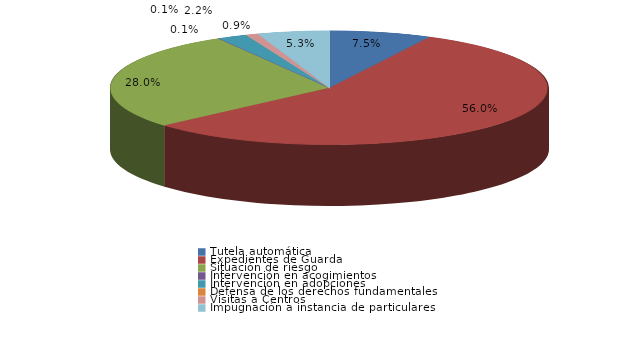
| Category | Series 0 |
|---|---|
| Tutela automática | 104 |
| Expedientes de Guarda | 777 |
| Situación de riesgo | 389 |
| Intervención en acogimientos | 1 |
| Intervención en adopciones | 30 |
| Defensa de los derechos fundamentales | 1 |
| Sustracción internacional de menores | 0 |
| Visitas a Centros | 12 |
| Ensayos Clínicos | 0 |
| Impugnación a instacia del Fiscal | 0 |
| Impugnación a instancia de particulares | 73 |